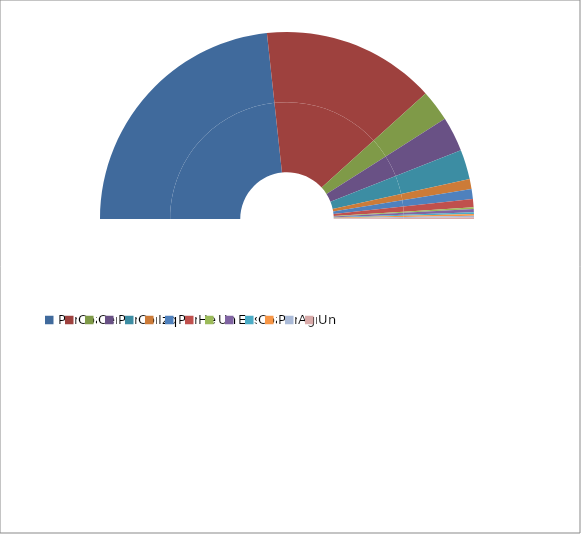
| Category | Series 0 | Partido Socialista Obrero Español (PSOE) |
|---|---|---|
| Partido Socialista Obrero Español (PSOE) | 163 | 46.571 |
| Coalición Popular (CP) | 105 | 30 |
| Centro Democrático y Social (CDS) | 19 | 5.429 |
| Partit dels Socialistes de Catalunya (PSC-PSOE) | 21 | 6 |
| Convergencia i Unió (CiU) | 18 | 5.143 |
| Izquierda Unida (IU) | 6 | 1.714 |
| Partido Nacionalista Vasco (PNV) | 6 | 1.714 |
| Herri Batasuna (HB)** | 5 | 1.429 |
| Unió de L`Esquerra Catalana (UEC) | 1 | 0.286 |
| Euskadiko Ezquerra (EE) | 2 | 0.571 |
| Coalición Galega (CG) | 1 | 0.286 |
| Partido Aragonés Regionalista (PAR) | 1 | 0.286 |
| Agrupaciones Independientes de Canarias (AIC) | 1 | 0.286 |
| Unió Valenciana (UV) | 1 | 0.286 |